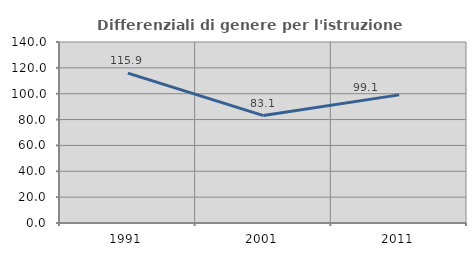
| Category | Differenziali di genere per l'istruzione superiore |
|---|---|
| 1991.0 | 115.88 |
| 2001.0 | 83.069 |
| 2011.0 | 99.097 |